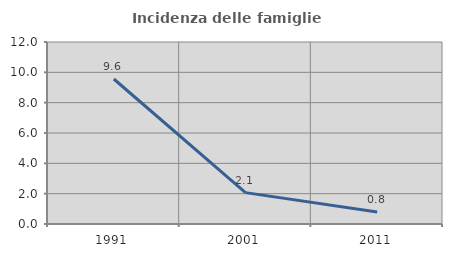
| Category | Incidenza delle famiglie numerose |
|---|---|
| 1991.0 | 9.56 |
| 2001.0 | 2.068 |
| 2011.0 | 0.791 |